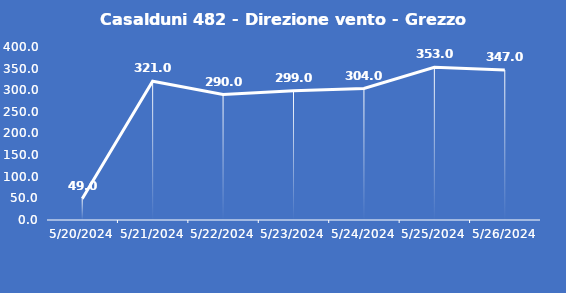
| Category | Casalduni 482 - Direzione vento - Grezzo (°N) |
|---|---|
| 5/20/24 | 49 |
| 5/21/24 | 321 |
| 5/22/24 | 290 |
| 5/23/24 | 299 |
| 5/24/24 | 304 |
| 5/25/24 | 353 |
| 5/26/24 | 347 |